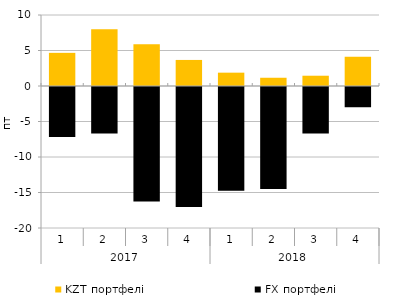
| Category | KZT портфелі | FX портфелі |
|---|---|---|
| 0 | 4.67 | -7.046 |
| 1 | 7.979 | -6.557 |
| 2 | 5.863 | -16.11 |
| 3 | 3.67 | -16.894 |
| 4 | 1.879 | -14.613 |
| 5 | 1.162 | -14.366 |
| 6 | 1.447 | -6.546 |
| 7 | 4.119 | -2.852 |